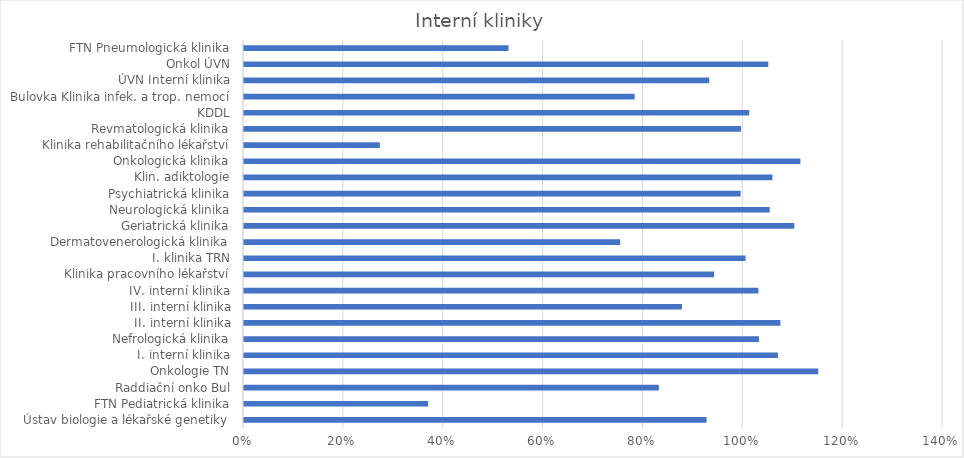
| Category | Series 0 |
|---|---|
| Ústav biologie a lékařské genetiky | 0.926 |
| FTN Pediatrická klinika | 0.369 |
| Raddiační onko Bul | 0.831 |
| Onkologie TN | 1.15 |
| I. interní klinika | 1.069 |
| Nefrologická klinika | 1.031 |
| II. interní klinika | 1.074 |
| III. interní klinika | 0.877 |
| IV. interní klinika | 1.03 |
| Klinika pracovního lékařství | 0.942 |
| I. klinika TRN | 1.005 |
| Dermatovenerologická klinika | 0.753 |
| Geriatrická klinika | 1.102 |
| Neurologická klinika | 1.053 |
| Psychiatrická klinika | 0.995 |
| Klin. adiktologie | 1.058 |
| Onkologická klinika | 1.114 |
| Klinika rehabilitačního lékařství | 0.272 |
| Revmatologická klinika | 0.995 |
| KDDL | 1.012 |
| Bulovka Klinika infek. a trop. nemocí | 0.782 |
| ÚVN Interní klinika | 0.932 |
| Onkol ÚVN | 1.05 |
| FTN Pneumologická klinika | 0.53 |